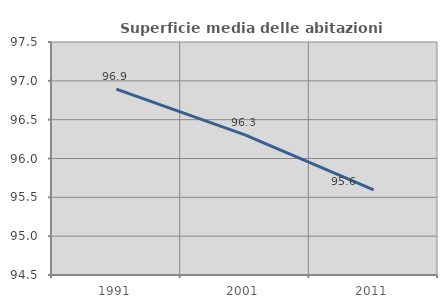
| Category | Superficie media delle abitazioni occupate |
|---|---|
| 1991.0 | 96.893 |
| 2001.0 | 96.304 |
| 2011.0 | 95.596 |